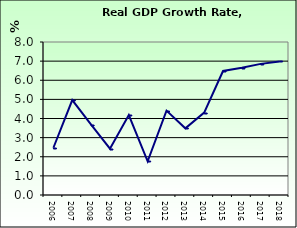
| Category | Real GDP Growth Rate |
|---|---|
| 2006.0 | 2.47 |
| 2007.0 | 4.965 |
| 2008.0 | 3.683 |
| 2009.0 | 2.423 |
| 2010.0 | 4.179 |
| 2011.0 | 1.761 |
| 2012.0 | 4.411 |
| 2013.0 | 3.485 |
| 2014.0 | 4.311 |
| 2015.0 | 6.485 |
| 2016.0 | 6.654 |
| 2017.0 | 6.856 |
| 2018.0 | 6.983 |